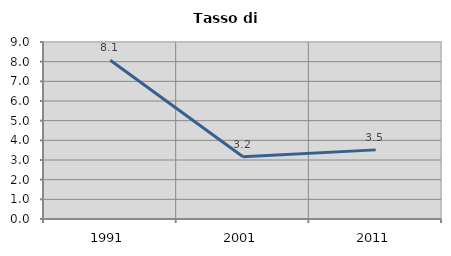
| Category | Tasso di disoccupazione   |
|---|---|
| 1991.0 | 8.068 |
| 2001.0 | 3.164 |
| 2011.0 | 3.515 |